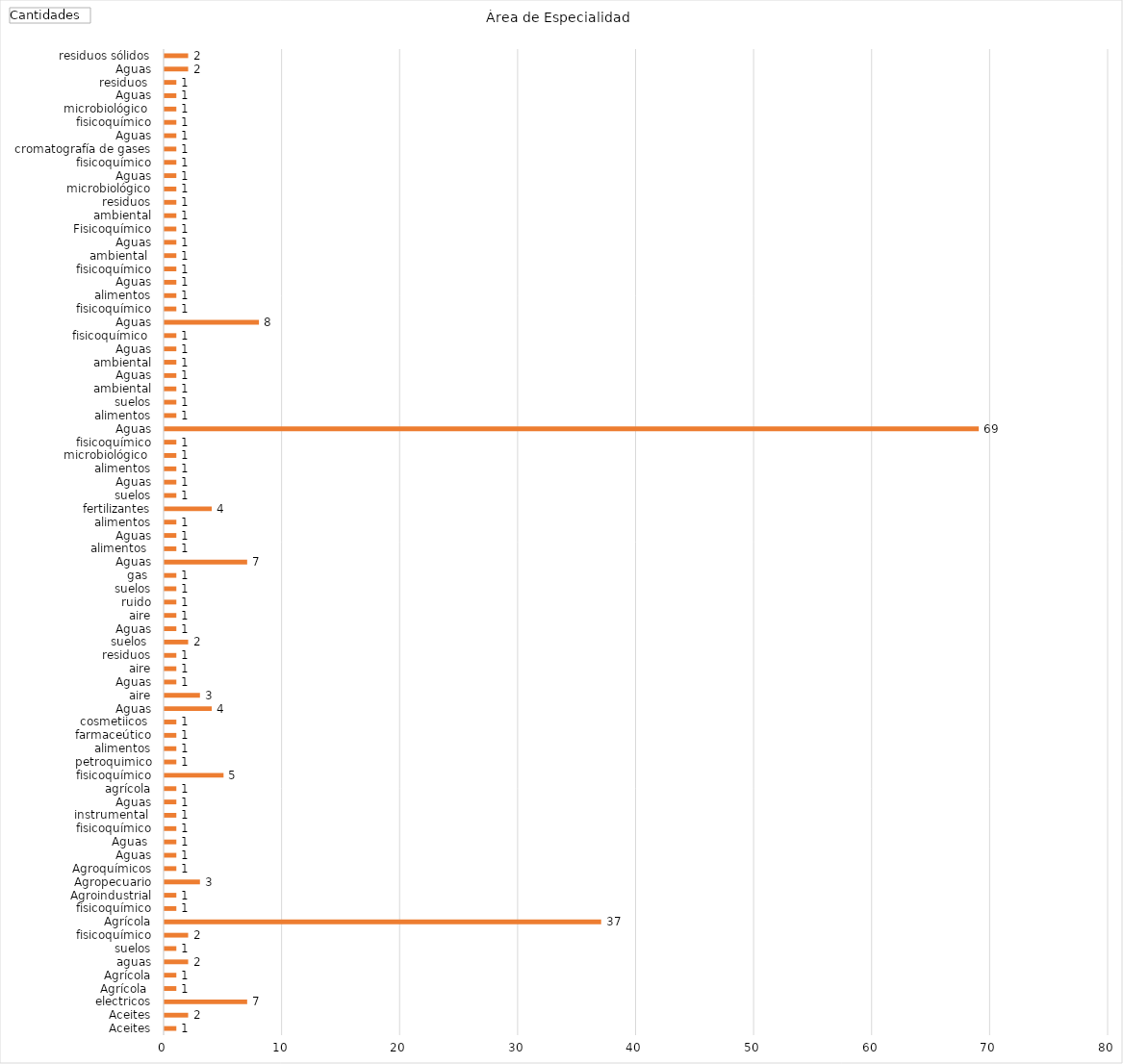
| Category | Total |
|---|---|
| Aceites | 1 |
| Aceites, electricos | 2 |
| Agrícola  | 7 |
| Agrícola, aguas, suelos, fisicoquímico | 1 |
| Agrícola, fisicoquímico | 1 |
| Agroindustrial | 2 |
| Agropecuario | 1 |
| Agroquímicos | 2 |
| Aguas | 37 |
| Aguas , fisicoquímico, instrumental  | 1 |
| Aguas, agrícola, fisicoquímico, petroquimico, alimentos, farmaceútico, cosmetiicos  | 1 |
| Aguas, aire | 3 |
| Aguas, aire, residuos, suelos  | 1 |
| Aguas, aire, ruido, suelos, gas  | 1 |
| Aguas, alimentos  | 1 |
| Aguas, alimentos, fertilizantes, suelos | 1 |
| Aguas, alimentos, microbiológico , fisicoquímico | 1 |
| Aguas, alimentos, suelos, ambiental | 1 |
| Aguas, ambiental | 1 |
| Aguas, fisicoquímico  | 5 |
| Aguas, fisicoquímico, alimentos | 1 |
| Aguas, fisicoquímico, ambiental  | 1 |
| Aguas, Fisicoquímico, ambiental, residuos, microbiológico | 1 |
| Aguas, fisicoquímico, cromatografía de gases | 1 |
| Aguas, fisicoquímico, microbiológico  | 4 |
| Aguas, residuos  | 3 |
| Aguas, residuos sólidos, ruido, aire | 1 |
| Aguas, suelos  | 1 |
| Aguas, suelos, agrícola, fisicoquímico, ambiental | 1 |
| Aguas, suelos, agrícola, fisicoquímico, ambiental, residuos | 2 |
| Aguas, suelos, agrícola, fisicoquímico, ambiental, residuos, alimentos | 1 |
| Aguas, suelos, aire | 1 |
| Aguas, suelos, alimentos, ambiental, forense, petroquímica  | 1 |
| Aguas, suelos, fisicoquímico, ambiental, residuos  | 1 |
| Aguas, suelos, foliar | 1 |
| Aire | 7 |
| Alcantarillado, aseo, aguas  | 1 |
| Alimentos animales, pastos, forrajes  | 1 |
| Alimentos de consumo humano y animal, cosméticos, fisicoquímico | 1 |
| Alimentos, aguas | 4 |
| Alimentos, aguas residuales  | 1 |
| Alimentos, aguas, ambiental, empaques, desinfectantes, limpiadores  | 1 |
| Alimentos, ambiental, fisicoquímico | 1 |
| Alimentos, ambiental, residuos | 1 |
| Alimentos, fisicoquímico | 1 |
| Ambiental | 69 |
| Ambiental,  fisicoquímico, Aguas | 1 |
| Ambiental, aire | 1 |
| Ambiental, alimentos y aguas | 1 |
| Armas, municiones, explosivos, accesorios y servicios complementarios  | 1 |
| Electricidad  | 1 |
| Emisiones atmosféricas | 1 |
| Farmaceútico | 1 |
| Fisicoquímico | 8 |
| Fisicoquímico, aguas   | 1 |
| Fisicoquímico, aguas, alimentos  | 1 |
| Fisicoquímico, alimentos, aguas, licores, cosmeticos,  | 1 |
| Fisicoquímico, alimentos, aguas, residuos y contaminantes, licores | 1 |
| Fisicoquímico, ambiental | 1 |
| Fisicoquímico, farmaceútico, dermatológicos,cosméticos, alimentos | 1 |
| Fisicoquímico, Industrial | 1 |
| Fisicoquímico, microbiológico | 1 |
| Fisicoquímico, microbiológico, aguas | 1 |
| Fisicoquímico, textil, cauchos, cueros, metales, plastico  | 1 |
| Insumos de laboratorio y dispositivoc médicos  | 1 |
| Materiales poliméricos | 1 |
| Metales  | 1 |
| Muestras biológicas | 1 |
| Recursos hidrobiologicos, aguas, ambiental | 1 |
| Residuos | 1 |
| Residuos de plaguicidas, contaminantes  | 1 |
| Salud, agrícola, ambiental | 1 |
| Suelos | 2 |
| Textiles  | 2 |